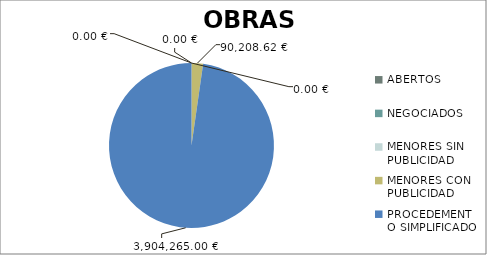
| Category | Series 0 |
|---|---|
| ABERTOS  | 0 |
| NEGOCIADOS  | 0 |
| MENORES SIN PUBLICIDAD | 0 |
| MENORES CON PUBLICIDAD | 90208.62 |
| PROCEDEMENTO SIMPLIFICADO | 3904265 |